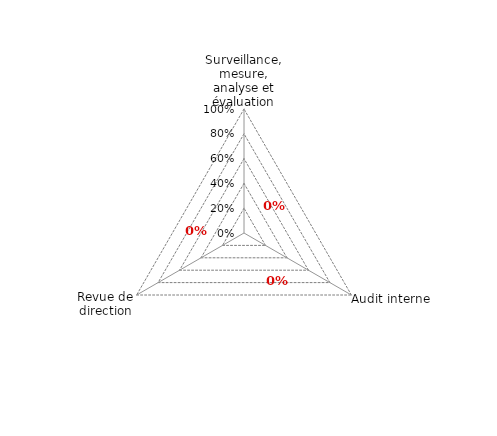
| Category | Article 7 |
|---|---|
| 0 | 0 |
| 1 | 0 |
| 2 | 0 |